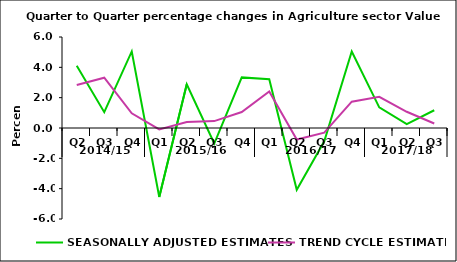
| Category | SEASONALLY ADJUSTED ESTIMATES | TREND CYCLE ESTIMATES |
|---|---|---|
| 0 | 4.099 | 2.835 |
| 1 | 1.044 | 3.318 |
| 2 | 5.047 | 0.971 |
| 3 | -4.549 | -0.091 |
| 4 | 2.881 | 0.394 |
| 5 | -1.024 | 0.454 |
| 6 | 3.337 | 1.056 |
| 7 | 3.218 | 2.413 |
| 8 | -4.073 | -0.761 |
| 9 | -0.876 | -0.307 |
| 10 | 5.04 | 1.738 |
| 11 | 1.363 | 2.055 |
| 12 | 0.251 | 1.069 |
| 13 | 1.17 | 0.295 |